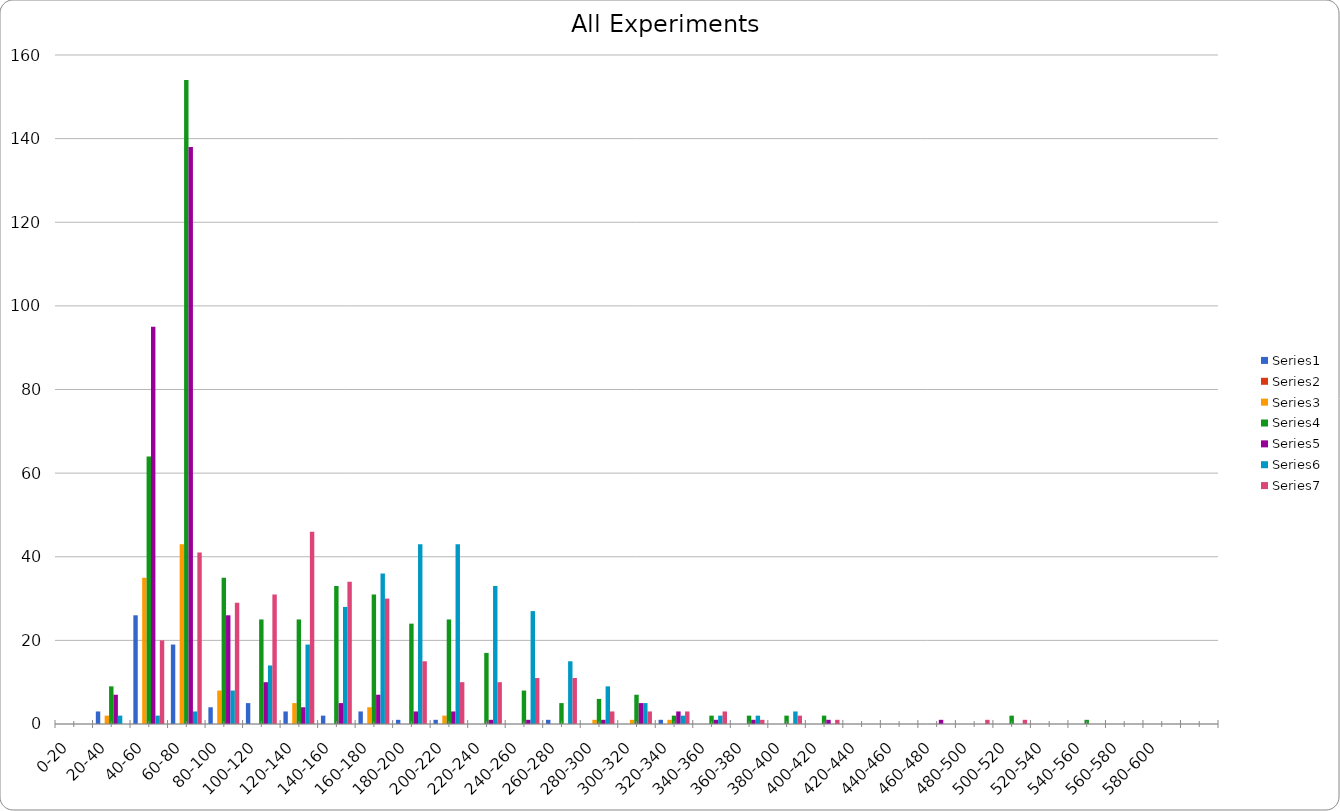
| Category | Series 0 | Series 1 | Series 2 | Series 3 | Series 4 | Series 5 | Series 6 |
|---|---|---|---|---|---|---|---|
| 0-20 | 0 | 0 | 0 | 0 | 0 | 0 | 0 |
| 20-40 | 3 | 0 | 2 | 9 | 7 | 2 | 0 |
| 40-60 | 26 | 0 | 35 | 64 | 95 | 2 | 20 |
| 60-80 | 19 | 0 | 43 | 154 | 138 | 3 | 41 |
| 80-100 | 4 | 0 | 8 | 35 | 26 | 8 | 29 |
| 100-120 | 5 | 0 | 0 | 25 | 10 | 14 | 31 |
| 120-140 | 3 | 0 | 5 | 25 | 4 | 19 | 46 |
| 140-160 | 2 | 0 | 0 | 33 | 5 | 28 | 34 |
| 160-180 | 3 | 0 | 4 | 31 | 7 | 36 | 30 |
| 180-200 | 1 | 0 | 0 | 24 | 3 | 43 | 15 |
| 200-220 | 1 | 0 | 2 | 25 | 3 | 43 | 10 |
| 220-240 | 0 | 0 | 0 | 17 | 1 | 33 | 10 |
| 240-260 | 0 | 0 | 0 | 8 | 1 | 27 | 11 |
| 260-280 | 1 | 0 | 0 | 5 | 0 | 15 | 11 |
| 280-300 | 0 | 0 | 1 | 6 | 1 | 9 | 3 |
| 300-320 | 0 | 0 | 1 | 7 | 5 | 5 | 3 |
| 320-340 | 1 | 0 | 1 | 2 | 3 | 2 | 3 |
| 340-360 | 0 | 0 | 0 | 2 | 1 | 2 | 3 |
| 360-380 | 0 | 0 | 0 | 2 | 1 | 2 | 1 |
| 380-400 | 0 | 0 | 0 | 2 | 0 | 3 | 2 |
| 400-420 | 0 | 0 | 0 | 2 | 1 | 0 | 1 |
| 420-440 | 0 | 0 | 0 | 0 | 0 | 0 | 0 |
| 440-460 | 0 | 0 | 0 | 0 | 0 | 0 | 0 |
| 460-480 | 0 | 0 | 0 | 0 | 1 | 0 | 0 |
| 480-500 | 0 | 0 | 0 | 0 | 0 | 0 | 1 |
| 500-520 | 0 | 0 | 0 | 2 | 0 | 0 | 1 |
| 520-540 | 0 | 0 | 0 | 0 | 0 | 0 | 0 |
| 540-560 | 0 | 0 | 0 | 1 | 0 | 0 | 0 |
| 560-580 | 0 | 0 | 0 | 0 | 0 | 0 | 0 |
| 580-600 | 0 | 0 | 0 | 0 | 0 | 0 | 0 |